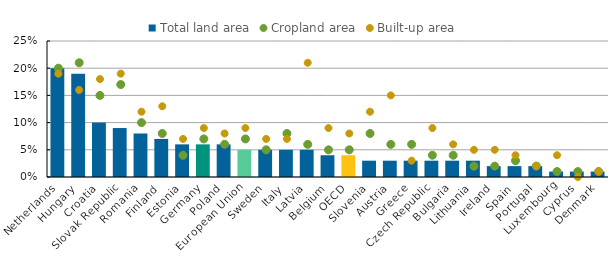
| Category | Total land area |
|---|---|
| Netherlands | 0.2 |
| Hungary | 0.19 |
| Croatia | 0.1 |
| Slovak Republic | 0.09 |
| Romania | 0.08 |
| Finland | 0.07 |
| Estonia | 0.06 |
| Germany | 0.06 |
| Poland | 0.06 |
| European Union | 0.05 |
| Sweden | 0.05 |
| Italy | 0.05 |
| Latvia | 0.05 |
| Belgium | 0.04 |
| OECD | 0.04 |
| Slovenia | 0.03 |
| Austria | 0.03 |
| Greece | 0.03 |
| Czech Republic | 0.03 |
| Bulgaria | 0.03 |
| Lithuania | 0.03 |
| Ireland | 0.02 |
| Spain | 0.02 |
| Portugal | 0.02 |
| Luxembourg | 0.01 |
| Cyprus | 0.01 |
| Denmark | 0.01 |